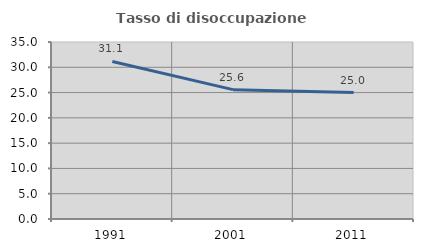
| Category | Tasso di disoccupazione giovanile  |
|---|---|
| 1991.0 | 31.148 |
| 2001.0 | 25.581 |
| 2011.0 | 25 |